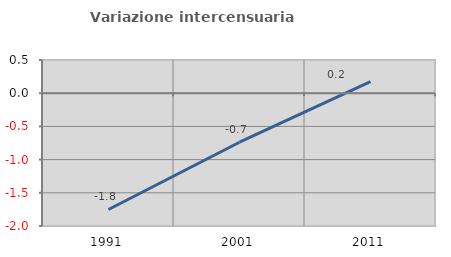
| Category | Variazione intercensuaria annua |
|---|---|
| 1991.0 | -1.751 |
| 2001.0 | -0.738 |
| 2011.0 | 0.175 |